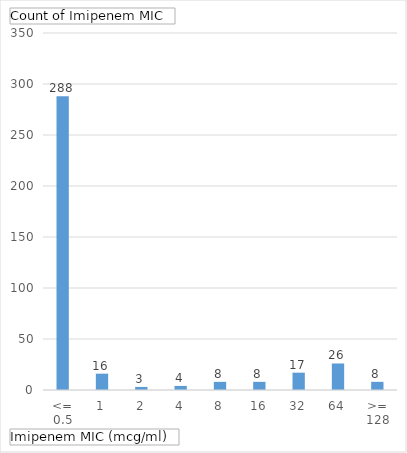
| Category | Total |
|---|---|
| <= 0.5 | 288 |
| 1 | 16 |
| 2 | 3 |
| 4 | 4 |
| 8 | 8 |
| 16 | 8 |
| 32 | 17 |
| 64 | 26 |
| >= 128 | 8 |